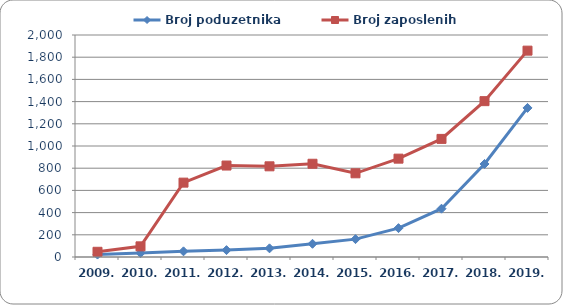
| Category | Broj poduzetnika  | Broj zaposlenih  |
|---|---|---|
| 2009. | 22 | 47 |
| 2010. | 35 | 96 |
| 2011. | 51 | 670 |
| 2012. | 62 | 824 |
| 2013. | 78 | 817 |
| 2014. | 119 | 840 |
| 2015. | 161 | 754 |
| 2016. | 260 | 886 |
| 2017. | 435 | 1064 |
| 2018. | 838 | 1404 |
| 2019. | 1343 | 1859 |